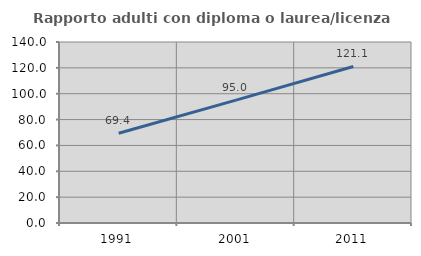
| Category | Rapporto adulti con diploma o laurea/licenza media  |
|---|---|
| 1991.0 | 69.403 |
| 2001.0 | 95.028 |
| 2011.0 | 121.053 |